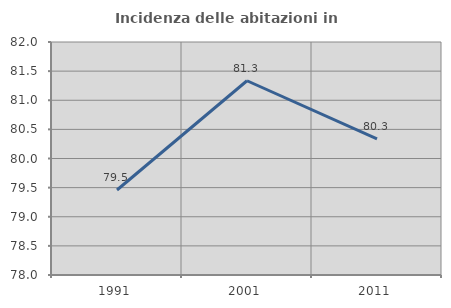
| Category | Incidenza delle abitazioni in proprietà  |
|---|---|
| 1991.0 | 79.459 |
| 2001.0 | 81.335 |
| 2011.0 | 80.336 |